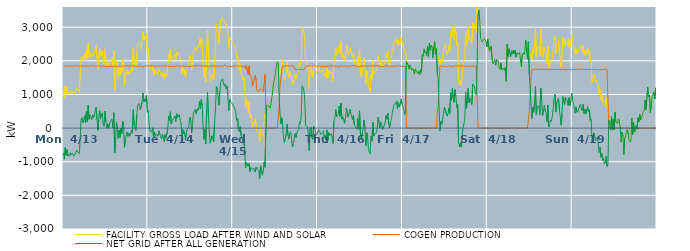
| Category | FACILITY GROSS LOAD AFTER WIND AND SOLAR | COGEN PRODUCTION | NET GRID AFTER ALL GENERATION |
|---|---|---|---|
|  Mon  4/13 | 1102 | 1840 | -738 |
|  Mon  4/13 | 901 | 1826 | -925 |
|  Mon  4/13 | 1254 | 1835 | -581 |
|  Mon  4/13 | 1013 | 1824 | -811 |
|  Mon  4/13 | 1208 | 1852 | -644 |
|  Mon  4/13 | 1005 | 1834 | -829 |
|  Mon  4/13 | 1051 | 1841 | -790 |
|  Mon  4/13 | 1019 | 1855 | -836 |
|  Mon  4/13 | 1110 | 1841 | -731 |
|  Mon  4/13 | 1040 | 1835 | -795 |
|  Mon  4/13 | 1102 | 1848 | -746 |
|  Mon  4/13 | 1069 | 1843 | -774 |
|  Mon  4/13 | 1000 | 1833 | -833 |
|  Mon  4/13 | 1059 | 1849 | -790 |
|  Mon  4/13 | 1077 | 1854 | -777 |
|  Mon  4/13 | 1197 | 1847 | -650 |
|  Mon  4/13 | 1133 | 1847 | -714 |
|  Mon  4/13 | 1143 | 1844 | -701 |
|  Mon  4/13 | 1071 | 1834 | -763 |
|  Mon  4/13 | 1581 | 1847 | -266 |
|  Mon  4/13 | 2106 | 1840 | 266 |
|  Mon  4/13 | 2146 | 1833 | 313 |
|  Mon  4/13 | 2012 | 1848 | 164 |
|  Mon  4/13 | 2089 | 1851 | 238 |
|  Mon  4/13 | 2207 | 1838 | 369 |
|  Mon  4/13 | 2001 | 1843 | 158 |
|  Mon  4/13 | 2347 | 1849 | 498 |
|  Mon  4/13 | 2049 | 1860 | 189 |
|  Mon  4/13 | 2512 | 1835 | 677 |
|  Mon  4/13 | 2100 | 1838 | 262 |
|  Mon  4/13 | 2244 | 1848 | 396 |
|  Mon  4/13 | 2231 | 1845 | 386 |
|  Mon  4/13 | 2101 | 1849 | 252 |
|  Mon  4/13 | 2225 | 1830 | 395 |
|  Mon  4/13 | 2163 | 1854 | 309 |
|  Mon  4/13 | 2199 | 1842 | 357 |
|  Mon  4/13 | 2353 | 1841 | 512 |
|  Mon  4/13 | 2458 | 1840 | 618 |
|  Mon  4/13 | 2095 | 1836 | 259 |
|  Mon  4/13 | 1766 | 1832 | -66 |
|  Mon  4/13 | 2123 | 1860 | 263 |
|  Mon  4/13 | 2371 | 1840 | 531 |
|  Mon  4/13 | 2121 | 1832 | 289 |
|  Mon  4/13 | 2251 | 1845 | 406 |
|  Mon  4/13 | 2293 | 1843 | 450 |
|  Mon  4/13 | 1930 | 1836 | 94 |
|  Mon  4/13 | 1891 | 1836 | 55 |
|  Mon  4/13 | 2358 | 1851 | 507 |
|  Mon  4/13 | 2023 | 1827 | 196 |
|  Mon  4/13 | 1859 | 1846 | 13 |
|  Mon  4/13 | 1951 | 1825 | 126 |
|  Mon  4/13 | 1825 | 1835 | -10 |
|  Mon  4/13 | 1968 | 1848 | 120 |
|  Mon  4/13 | 2028 | 1836 | 192 |
|  Mon  4/13 | 1999 | 1834 | 165 |
|  Mon  4/13 | 2099 | 1834 | 265 |
|  Mon  4/13 | 1834 | 1829 | 5 |
|  Mon  4/13 | 2299 | 1842 | 457 |
|  Mon  4/13 | 1120 | 1857 | -737 |
|  Mon  4/13 | 1453 | 1847 | -394 |
|  Mon  4/13 | 2012 | 1827 | 185 |
|  Mon  4/13 | 1830 | 1851 | -21 |
|  Mon  4/13 | 1538 | 1849 | -311 |
|  Mon  4/13 | 1791 | 1848 | -57 |
|  Mon  4/13 | 1556 | 1833 | -277 |
|  Mon  4/13 | 1841 | 1851 | -10 |
|  Mon  4/13 | 1662 | 1838 | -176 |
|  Mon  4/13 | 2052 | 1846 | 206 |
|  Mon  4/13 | 2009 | 1846 | 163 |
|  Mon  4/13 | 1263 | 1839 | -576 |
|  Mon  4/13 | 1503 | 1851 | -348 |
|  Mon  4/13 | 1607 | 1851 | -244 |
|  Mon  4/13 | 1732 | 1852 | -120 |
|  Mon  4/13 | 1605 | 1848 | -243 |
|  Mon  4/13 | 1687 | 1840 | -153 |
|  Mon  4/13 | 1614 | 1855 | -241 |
|  Mon  4/13 | 1664 | 1845 | -181 |
|  Mon  4/13 | 1771 | 1843 | -72 |
|  Mon  4/13 | 1704 | 1855 | -151 |
|  Mon  4/13 | 2373 | 1828 | 545 |
|  Mon  4/13 | 1948 | 1850 | 98 |
|  Mon  4/13 | 1861 | 1830 | 31 |
|  Mon  4/13 | 1765 | 1828 | -63 |
|  Mon  4/13 | 2227 | 1846 | 381 |
|  Mon  4/13 | 2544 | 1847 | 697 |
|  Mon  4/13 | 2571 | 1858 | 713 |
|  Mon  4/13 | 2579 | 1849 | 730 |
|  Mon  4/13 | 2394 | 1853 | 541 |
|  Mon  4/13 | 2362 | 1838 | 524 |
|  Mon  4/13 | 2613 | 1839 | 774 |
|  Mon  4/13 | 2869 | 1825 | 1044 |
|  Mon  4/13 | 2640 | 1853 | 787 |
|  Mon  4/13 | 2717 | 1850 | 867 |
|  Mon  4/13 | 2625 | 1831 | 794 |
|  Mon  4/13 | 2812 | 1846 | 966 |
|  Mon  4/13 | 2310 | 1840 | 470 |
|  Tue  4/14 | 2374 | 1858 | 516 |
|  Tue  4/14 | 1931 | 1835 | 96 |
|  Tue  4/14 | 1749 | 1841 | -92 |
|  Tue  4/14 | 1738 | 1851 | -113 |
|  Tue  4/14 | 1741 | 1854 | -113 |
|  Tue  4/14 | 1852 | 1842 | 10 |
|  Tue  4/14 | 1556 | 1835 | -279 |
|  Tue  4/14 | 1734 | 1857 | -123 |
|  Tue  4/14 | 1604 | 1850 | -246 |
|  Tue  4/14 | 1672 | 1844 | -172 |
|  Tue  4/14 | 1669 | 1837 | -168 |
|  Tue  4/14 | 1605 | 1847 | -242 |
|  Tue  4/14 | 1766 | 1843 | -77 |
|  Tue  4/14 | 1672 | 1854 | -182 |
|  Tue  4/14 | 1638 | 1845 | -207 |
|  Tue  4/14 | 1516 | 1842 | -326 |
|  Tue  4/14 | 1652 | 1836 | -184 |
|  Tue  4/14 | 1564 | 1850 | -286 |
|  Tue  4/14 | 1459 | 1855 | -396 |
|  Tue  4/14 | 1642 | 1838 | -196 |
|  Tue  4/14 | 1551 | 1849 | -298 |
|  Tue  4/14 | 1519 | 1840 | -321 |
|  Tue  4/14 | 1816 | 1842 | -26 |
|  Tue  4/14 | 2195 | 1839 | 356 |
|  Tue  4/14 | 2066 | 1835 | 231 |
|  Tue  4/14 | 2336 | 1850 | 486 |
|  Tue  4/14 | 1960 | 1842 | 118 |
|  Tue  4/14 | 2096 | 1850 | 246 |
|  Tue  4/14 | 2102 | 1834 | 268 |
|  Tue  4/14 | 2136 | 1846 | 290 |
|  Tue  4/14 | 2194 | 1837 | 357 |
|  Tue  4/14 | 2050 | 1856 | 194 |
|  Tue  4/14 | 2279 | 1851 | 428 |
|  Tue  4/14 | 2155 | 1843 | 312 |
|  Tue  4/14 | 2180 | 1845 | 335 |
|  Tue  4/14 | 2252 | 1850 | 402 |
|  Tue  4/14 | 2087 | 1839 | 248 |
|  Tue  4/14 | 1991 | 1839 | 152 |
|  Tue  4/14 | 1613 | 1841 | -228 |
|  Tue  4/14 | 1808 | 1855 | -47 |
|  Tue  4/14 | 1684 | 1847 | -163 |
|  Tue  4/14 | 1744 | 1850 | -106 |
|  Tue  4/14 | 1492 | 1836 | -344 |
|  Tue  4/14 | 1672 | 1845 | -173 |
|  Tue  4/14 | 1808 | 1841 | -33 |
|  Tue  4/14 | 1856 | 1844 | 12 |
|  Tue  4/14 | 1942 | 1837 | 105 |
|  Tue  4/14 | 2167 | 1842 | 325 |
|  Tue  4/14 | 2082 | 1835 | 247 |
|  Tue  4/14 | 1709 | 1854 | -145 |
|  Tue  4/14 | 1938 | 1840 | 98 |
|  Tue  4/14 | 2304 | 1861 | 443 |
|  Tue  4/14 | 2312 | 1852 | 460 |
|  Tue  4/14 | 2401 | 1840 | 561 |
|  Tue  4/14 | 2278 | 1850 | 428 |
|  Tue  4/14 | 2273 | 1856 | 417 |
|  Tue  4/14 | 2435 | 1850 | 585 |
|  Tue  4/14 | 2393 | 1848 | 545 |
|  Tue  4/14 | 2654 | 1855 | 799 |
|  Tue  4/14 | 2426 | 1851 | 575 |
|  Tue  4/14 | 2694 | 1848 | 846 |
|  Tue  4/14 | 2514 | 1854 | 660 |
|  Tue  4/14 | 1856 | 1842 | 14 |
|  Tue  4/14 | 1508 | 1847 | -339 |
|  Tue  4/14 | 1810 | 1841 | -31 |
|  Tue  4/14 | 1378 | 1846 | -468 |
|  Tue  4/14 | 2370 | 1843 | 527 |
|  Tue  4/14 | 2914 | 1844 | 1070 |
|  Tue  4/14 | 2187 | 1826 | 361 |
|  Tue  4/14 | 1718 | 1844 | -126 |
|  Tue  4/14 | 1391 | 1842 | -451 |
|  Tue  4/14 | 1421 | 1869 | -448 |
|  Tue  4/14 | 1619 | 1847 | -228 |
|  Tue  4/14 | 1517 | 1837 | -320 |
|  Tue  4/14 | 1437 | 1849 | -412 |
|  Tue  4/14 | 2025 | 1841 | 184 |
|  Tue  4/14 | 2398 | 1842 | 556 |
|  Tue  4/14 | 3087 | 1841 | 1246 |
|  Tue  4/14 | 2966 | 1843 | 1123 |
|  Tue  4/14 | 2808 | 1846 | 962 |
|  Tue  4/14 | 2514 | 1833 | 681 |
|  Tue  4/14 | 2952 | 1848 | 1104 |
|  Tue  4/14 | 3237 | 1848 | 1389 |
|  Tue  4/14 | 3225 | 1834 | 1391 |
|  Tue  4/14 | 3288 | 1828 | 1460 |
|  Tue  4/14 | 3155 | 1846 | 1309 |
|  Tue  4/14 | 3129 | 1869 | 1260 |
|  Tue  4/14 | 3167 | 1848 | 1319 |
|  Tue  4/14 | 3030 | 1855 | 1175 |
|  Tue  4/14 | 3079 | 1825 | 1254 |
|  Tue  4/14 | 2830 | 1854 | 976 |
|  Tue  4/14 | 2354 | 1839 | 515 |
|  Tue  4/14 | 2689 | 1833 | 856 |
|  Tue  4/14 | 2626 | 1838 | 788 |
|  Tue  4/14 | 2630 | 1838 | 792 |
|  Tue  4/14 | 2551 | 1830 | 721 |
|  Wed  4/15 | 2545 | 1844 | 701 |
|  Wed  4/15 | 2465 | 1847 | 618 |
|  Wed  4/15 | 2412 | 1841 | 571 |
|  Wed  4/15 | 2319 | 1848 | 471 |
|  Wed  4/15 | 2085 | 1854 | 231 |
|  Wed  4/15 | 2146 | 1851 | 295 |
|  Wed  4/15 | 1809 | 1862 | -53 |
|  Wed  4/15 | 1731 | 1839 | -108 |
|  Wed  4/15 | 1884 | 1836 | 48 |
|  Wed  4/15 | 1622 | 1844 | -222 |
|  Wed  4/15 | 1608 | 1849 | -241 |
|  Wed  4/15 | 1425 | 1825 | -400 |
|  Wed  4/15 | 1520 | 1851 | -331 |
|  Wed  4/15 | 1220 | 1834 | -614 |
|  Wed  4/15 | 574 | 1759 | -1185 |
|  Wed  4/15 | 846 | 1855 | -1009 |
|  Wed  4/15 | 766 | 1831 | -1065 |
|  Wed  4/15 | 456 | 1597 | -1141 |
|  Wed  4/15 | 784 | 1834 | -1050 |
|  Wed  4/15 | 299 | 1584 | -1285 |
|  Wed  4/15 | 406 | 1582 | -1176 |
|  Wed  4/15 | 270 | 1468 | -1198 |
|  Wed  4/15 | 22 | 1252 | -1230 |
|  Wed  4/15 | 178 | 1367 | -1189 |
|  Wed  4/15 | 144 | 1367 | -1223 |
|  Wed  4/15 | 266 | 1573 | -1307 |
|  Wed  4/15 | 254 | 1411 | -1157 |
|  Wed  4/15 | -104 | 1103 | -1207 |
|  Wed  4/15 | -125 | 1094 | -1219 |
|  Wed  4/15 | -171 | 1092 | -1263 |
|  Wed  4/15 | -409 | 1096 | -1505 |
|  Wed  4/15 | 56 | 1178 | -1122 |
|  Wed  4/15 | -102 | 1140 | -1242 |
|  Wed  4/15 | -242 | 1156 | -1398 |
|  Wed  4/15 | -203 | 1073 | -1276 |
|  Wed  4/15 | 290 | 1304 | -1014 |
|  Wed  4/15 | 429 | 1594 | -1165 |
|  Wed  4/15 | 389 | 454 | -65 |
|  Wed  4/15 | 672 | 0 | 672 |
|  Wed  4/15 | 674 | 0 | 674 |
|  Wed  4/15 | 666 | 0 | 666 |
|  Wed  4/15 | 668 | 0 | 668 |
|  Wed  4/15 | 593 | 0 | 593 |
|  Wed  4/15 | 751 | 0 | 751 |
|  Wed  4/15 | 944 | 0 | 944 |
|  Wed  4/15 | 925 | 0 | 925 |
|  Wed  4/15 | 1374 | 0 | 1374 |
|  Wed  4/15 | 1484 | 0 | 1484 |
|  Wed  4/15 | 1694 | 0 | 1694 |
|  Wed  4/15 | 1718 | 0 | 1718 |
|  Wed  4/15 | 1974 | 0 | 1974 |
|  Wed  4/15 | 1887 | 0 | 1887 |
|  Wed  4/15 | 1538 | 603 | 935 |
|  Wed  4/15 | 1698 | 1252 | 446 |
|  Wed  4/15 | 1616 | 1489 | 127 |
|  Wed  4/15 | 2048 | 1742 | 306 |
|  Wed  4/15 | 1891 | 1854 | 37 |
|  Wed  4/15 | 1547 | 1851 | -304 |
|  Wed  4/15 | 1419 | 1842 | -423 |
|  Wed  4/15 | 1440 | 1856 | -416 |
|  Wed  4/15 | 1656 | 1842 | -186 |
|  Wed  4/15 | 1955 | 1839 | 116 |
|  Wed  4/15 | 1653 | 1856 | -203 |
|  Wed  4/15 | 1502 | 1827 | -325 |
|  Wed  4/15 | 1683 | 1842 | -159 |
|  Wed  4/15 | 1703 | 1817 | -114 |
|  Wed  4/15 | 1546 | 1852 | -306 |
|  Wed  4/15 | 1284 | 1841 | -557 |
|  Wed  4/15 | 1373 | 1844 | -471 |
|  Wed  4/15 | 1363 | 1845 | -482 |
|  Wed  4/15 | 1584 | 1744 | -160 |
|  Wed  4/15 | 1462 | 1735 | -273 |
|  Wed  4/15 | 1585 | 1722 | -137 |
|  Wed  4/15 | 1595 | 1744 | -149 |
|  Wed  4/15 | 1704 | 1749 | -45 |
|  Wed  4/15 | 1934 | 1742 | 192 |
|  Wed  4/15 | 1876 | 1742 | 134 |
|  Wed  4/15 | 2097 | 1731 | 366 |
|  Wed  4/15 | 3000 | 1745 | 1255 |
|  Wed  4/15 | 2966 | 1750 | 1216 |
|  Wed  4/15 | 2852 | 1734 | 1118 |
|  Wed  4/15 | 2603 | 1740 | 863 |
|  Wed  4/15 | 1921 | 1837 | 84 |
|  Wed  4/15 | 1966 | 1863 | 103 |
|  Wed  4/15 | 1883 | 1842 | 41 |
|  Wed  4/15 | 1695 | 1848 | -153 |
|  Wed  4/15 | 1186 | 1856 | -670 |
|  Wed  4/15 | 1812 | 1848 | -36 |
|  Wed  4/15 | 1871 | 1841 | 30 |
|  Wed  4/15 | 1579 | 1850 | -271 |
|  Wed  4/15 | 1506 | 1843 | -337 |
|  Wed  4/15 | 1877 | 1820 | 57 |
|  Wed  4/15 | 1849 | 1859 | -10 |
|  Wed  4/15 | 1786 | 1846 | -60 |
|  Wed  4/15 | 1622 | 1834 | -212 |
|  Wed  4/15 | 1680 | 1850 | -170 |
|  Thu  4/16 | 1746 | 1851 | -105 |
|  Thu  4/16 | 1801 | 1854 | -53 |
|  Thu  4/16 | 1724 | 1838 | -114 |
|  Thu  4/16 | 1646 | 1842 | -196 |
|  Thu  4/16 | 1619 | 1837 | -218 |
|  Thu  4/16 | 1701 | 1833 | -132 |
|  Thu  4/16 | 1753 | 1843 | -90 |
|  Thu  4/16 | 1559 | 1851 | -292 |
|  Thu  4/16 | 1615 | 1828 | -213 |
|  Thu  4/16 | 1497 | 1844 | -347 |
|  Thu  4/16 | 1785 | 1840 | -55 |
|  Thu  4/16 | 1469 | 1838 | -369 |
|  Thu  4/16 | 1713 | 1846 | -133 |
|  Thu  4/16 | 1618 | 1841 | -223 |
|  Thu  4/16 | 1596 | 1846 | -250 |
|  Thu  4/16 | 1680 | 1849 | -169 |
|  Thu  4/16 | 1568 | 1856 | -288 |
|  Thu  4/16 | 1393 | 1850 | -457 |
|  Thu  4/16 | 2046 | 1842 | 204 |
|  Thu  4/16 | 2123 | 1850 | 273 |
|  Thu  4/16 | 2404 | 1849 | 555 |
|  Thu  4/16 | 2163 | 1825 | 338 |
|  Thu  4/16 | 2145 | 1833 | 312 |
|  Thu  4/16 | 2275 | 1848 | 427 |
|  Thu  4/16 | 2465 | 1809 | 656 |
|  Thu  4/16 | 2202 | 1855 | 347 |
|  Thu  4/16 | 2591 | 1847 | 744 |
|  Thu  4/16 | 2109 | 1842 | 267 |
|  Thu  4/16 | 2191 | 1854 | 337 |
|  Thu  4/16 | 2111 | 1840 | 271 |
|  Thu  4/16 | 1990 | 1848 | 142 |
|  Thu  4/16 | 2147 | 1849 | 298 |
|  Thu  4/16 | 2457 | 1860 | 597 |
|  Thu  4/16 | 2398 | 1827 | 571 |
|  Thu  4/16 | 2183 | 1855 | 328 |
|  Thu  4/16 | 2247 | 1841 | 406 |
|  Thu  4/16 | 2395 | 1835 | 560 |
|  Thu  4/16 | 2297 | 1848 | 449 |
|  Thu  4/16 | 2322 | 1846 | 476 |
|  Thu  4/16 | 2109 | 1857 | 252 |
|  Thu  4/16 | 2213 | 1840 | 373 |
|  Thu  4/16 | 1952 | 1849 | 103 |
|  Thu  4/16 | 1914 | 1856 | 58 |
|  Thu  4/16 | 1851 | 1854 | -3 |
|  Thu  4/16 | 1820 | 1855 | -35 |
|  Thu  4/16 | 2135 | 1838 | 297 |
|  Thu  4/16 | 1822 | 1861 | -39 |
|  Thu  4/16 | 2342 | 1832 | 510 |
|  Thu  4/16 | 1653 | 1842 | -189 |
|  Thu  4/16 | 1495 | 1841 | -346 |
|  Thu  4/16 | 1666 | 1841 | -175 |
|  Thu  4/16 | 1815 | 1848 | -33 |
|  Thu  4/16 | 2082 | 1841 | 241 |
|  Thu  4/16 | 1883 | 1856 | 27 |
|  Thu  4/16 | 1317 | 1842 | -525 |
|  Thu  4/16 | 1702 | 1835 | -133 |
|  Thu  4/16 | 1611 | 1841 | -230 |
|  Thu  4/16 | 1242 | 1843 | -601 |
|  Thu  4/16 | 1135 | 1856 | -721 |
|  Thu  4/16 | 1078 | 1849 | -771 |
|  Thu  4/16 | 1608 | 1846 | -238 |
|  Thu  4/16 | 1460 | 1848 | -388 |
|  Thu  4/16 | 2006 | 1833 | 173 |
|  Thu  4/16 | 1611 | 1848 | -237 |
|  Thu  4/16 | 1670 | 1841 | -171 |
|  Thu  4/16 | 1698 | 1846 | -148 |
|  Thu  4/16 | 1710 | 1848 | -138 |
|  Thu  4/16 | 1845 | 1856 | -11 |
|  Thu  4/16 | 2162 | 1836 | 326 |
|  Thu  4/16 | 2015 | 1840 | 175 |
|  Thu  4/16 | 1863 | 1850 | 13 |
|  Thu  4/16 | 2010 | 1829 | 181 |
|  Thu  4/16 | 1974 | 1851 | 123 |
|  Thu  4/16 | 1793 | 1835 | -42 |
|  Thu  4/16 | 1877 | 1841 | 36 |
|  Thu  4/16 | 1909 | 1843 | 66 |
|  Thu  4/16 | 2009 | 1828 | 181 |
|  Thu  4/16 | 2229 | 1854 | 375 |
|  Thu  4/16 | 2114 | 1851 | 263 |
|  Thu  4/16 | 2290 | 1846 | 444 |
|  Thu  4/16 | 1965 | 1848 | 117 |
|  Thu  4/16 | 1851 | 1839 | 12 |
|  Thu  4/16 | 2037 | 1838 | 199 |
|  Thu  4/16 | 2072 | 1839 | 233 |
|  Thu  4/16 | 2308 | 1846 | 462 |
|  Thu  4/16 | 2278 | 1831 | 447 |
|  Thu  4/16 | 2535 | 1833 | 702 |
|  Thu  4/16 | 2536 | 1842 | 694 |
|  Thu  4/16 | 2591 | 1850 | 741 |
|  Thu  4/16 | 2655 | 1848 | 807 |
|  Thu  4/16 | 2433 | 1851 | 582 |
|  Thu  4/16 | 2609 | 1854 | 755 |
|  Thu  4/16 | 2466 | 1836 | 630 |
|  Thu  4/16 | 2545 | 1832 | 713 |
|  Thu  4/16 | 2707 | 1842 | 865 |
|  Thu  4/16 | 2555 | 1835 | 720 |
|  Fri  4/17 | 2569 | 1858 | 711 |
|  Fri  4/17 | 2383 | 1834 | 549 |
|  Fri  4/17 | 2246 | 1843 | 403 |
|  Fri  4/17 | 2291 | 1843 | 448 |
|  Fri  4/17 | 1979 | 0 | 1979 |
|  Fri  4/17 | 1988 | 0 | 1988 |
|  Fri  4/17 | 1869 | 0 | 1869 |
|  Fri  4/17 | 1750 | 0 | 1750 |
|  Fri  4/17 | 1876 | 0 | 1876 |
|  Fri  4/17 | 1823 | 0 | 1823 |
|  Fri  4/17 | 1715 | 0 | 1715 |
|  Fri  4/17 | 1770 | 0 | 1770 |
|  Fri  4/17 | 1728 | 0 | 1728 |
|  Fri  4/17 | 1601 | 0 | 1601 |
|  Fri  4/17 | 1762 | 0 | 1762 |
|  Fri  4/17 | 1720 | 0 | 1720 |
|  Fri  4/17 | 1706 | 0 | 1706 |
|  Fri  4/17 | 1611 | 0 | 1611 |
|  Fri  4/17 | 1691 | 0 | 1691 |
|  Fri  4/17 | 1580 | 0 | 1580 |
|  Fri  4/17 | 1736 | 0 | 1736 |
|  Fri  4/17 | 1658 | 0 | 1658 |
|  Fri  4/17 | 2183 | 0 | 2183 |
|  Fri  4/17 | 2135 | 0 | 2135 |
|  Fri  4/17 | 2354 | 0 | 2354 |
|  Fri  4/17 | 2228 | 0 | 2228 |
|  Fri  4/17 | 2279 | 0 | 2279 |
|  Fri  4/17 | 2153 | 0 | 2153 |
|  Fri  4/17 | 2421 | 0 | 2421 |
|  Fri  4/17 | 2115 | 0 | 2115 |
|  Fri  4/17 | 2524 | 0 | 2524 |
|  Fri  4/17 | 2317 | 0 | 2317 |
|  Fri  4/17 | 2467 | 0 | 2467 |
|  Fri  4/17 | 2430 | 0 | 2430 |
|  Fri  4/17 | 2081 | 0 | 2081 |
|  Fri  4/17 | 2408 | 0 | 2408 |
|  Fri  4/17 | 2570 | 0 | 2570 |
|  Fri  4/17 | 2191 | 0 | 2191 |
|  Fri  4/17 | 2359 | 0 | 2359 |
|  Fri  4/17 | 2085 | 461 | 1624 |
|  Fri  4/17 | 2124 | 692 | 1432 |
|  Fri  4/17 | 1947 | 1397 | 550 |
|  Fri  4/17 | 1778 | 1860 | -82 |
|  Fri  4/17 | 2052 | 1854 | 198 |
|  Fri  4/17 | 1955 | 1839 | 116 |
|  Fri  4/17 | 2101 | 1843 | 258 |
|  Fri  4/17 | 2285 | 1843 | 442 |
|  Fri  4/17 | 2478 | 1855 | 623 |
|  Fri  4/17 | 2436 | 1833 | 603 |
|  Fri  4/17 | 2279 | 1848 | 431 |
|  Fri  4/17 | 2176 | 1824 | 352 |
|  Fri  4/17 | 2277 | 1848 | 429 |
|  Fri  4/17 | 2454 | 1857 | 597 |
|  Fri  4/17 | 2269 | 1843 | 426 |
|  Fri  4/17 | 2873 | 1827 | 1046 |
|  Fri  4/17 | 2669 | 1843 | 826 |
|  Fri  4/17 | 3005 | 1833 | 1172 |
|  Fri  4/17 | 2728 | 1842 | 886 |
|  Fri  4/17 | 2610 | 1849 | 761 |
|  Fri  4/17 | 2991 | 1846 | 1145 |
|  Fri  4/17 | 2788 | 1847 | 941 |
|  Fri  4/17 | 2463 | 1851 | 612 |
|  Fri  4/17 | 2555 | 1845 | 710 |
|  Fri  4/17 | 1427 | 1838 | -411 |
|  Fri  4/17 | 1294 | 1852 | -558 |
|  Fri  4/17 | 1405 | 1845 | -440 |
|  Fri  4/17 | 1276 | 1832 | -556 |
|  Fri  4/17 | 1552 | 1830 | -278 |
|  Fri  4/17 | 1888 | 1861 | 27 |
|  Fri  4/17 | 1875 | 1829 | 46 |
|  Fri  4/17 | 2053 | 1838 | 215 |
|  Fri  4/17 | 2918 | 1845 | 1073 |
|  Fri  4/17 | 2443 | 1854 | 589 |
|  Fri  4/17 | 2428 | 1832 | 596 |
|  Fri  4/17 | 3027 | 1847 | 1180 |
|  Fri  4/17 | 2593 | 1845 | 748 |
|  Fri  4/17 | 2724 | 1848 | 876 |
|  Fri  4/17 | 2678 | 1843 | 835 |
|  Fri  4/17 | 2534 | 1832 | 702 |
|  Fri  4/17 | 3153 | 1851 | 1302 |
|  Fri  4/17 | 3165 | 1852 | 1313 |
|  Fri  4/17 | 3066 | 1834 | 1232 |
|  Fri  4/17 | 2893 | 1854 | 1039 |
|  Fri  4/17 | 2841 | 1849 | 992 |
|  Fri  4/17 | 3701 | 1834 | 1867 |
|  Fri  4/17 | 3384 | 0 | 3384 |
|  Fri  4/17 | 3509 | 0 | 3509 |
|  Fri  4/17 | 3203 | 0 | 3203 |
|  Fri  4/17 | 2653 | 0 | 2653 |
|  Fri  4/17 | 2660 | 0 | 2660 |
|  Fri  4/17 | 2560 | 0 | 2560 |
|  Fri  4/17 | 2611 | 0 | 2611 |
|  Fri  4/17 | 2659 | 0 | 2659 |
|  Fri  4/17 | 2646 | 0 | 2646 |
|  Fri  4/17 | 2592 | 0 | 2592 |
|  Fri  4/17 | 2415 | 0 | 2415 |
|  Sat  4/18 | 2647 | 0 | 2647 |
|  Sat  4/18 | 2619 | 0 | 2619 |
|  Sat  4/18 | 2287 | 0 | 2287 |
|  Sat  4/18 | 2343 | 0 | 2343 |
|  Sat  4/18 | 2443 | 0 | 2443 |
|  Sat  4/18 | 2018 | 0 | 2018 |
|  Sat  4/18 | 1915 | 0 | 1915 |
|  Sat  4/18 | 1895 | 0 | 1895 |
|  Sat  4/18 | 2035 | 0 | 2035 |
|  Sat  4/18 | 1874 | 0 | 1874 |
|  Sat  4/18 | 2038 | 0 | 2038 |
|  Sat  4/18 | 2038 | 0 | 2038 |
|  Sat  4/18 | 1995 | 0 | 1995 |
|  Sat  4/18 | 1792 | 0 | 1792 |
|  Sat  4/18 | 1744 | 0 | 1744 |
|  Sat  4/18 | 1937 | 0 | 1937 |
|  Sat  4/18 | 1724 | 0 | 1724 |
|  Sat  4/18 | 1738 | 0 | 1738 |
|  Sat  4/18 | 1781 | 0 | 1781 |
|  Sat  4/18 | 1712 | 0 | 1712 |
|  Sat  4/18 | 1817 | 0 | 1817 |
|  Sat  4/18 | 1391 | 0 | 1391 |
|  Sat  4/18 | 2491 | 0 | 2491 |
|  Sat  4/18 | 2124 | 0 | 2124 |
|  Sat  4/18 | 2360 | 0 | 2360 |
|  Sat  4/18 | 2369 | 0 | 2369 |
|  Sat  4/18 | 2131 | 0 | 2131 |
|  Sat  4/18 | 2298 | 0 | 2298 |
|  Sat  4/18 | 2202 | 0 | 2202 |
|  Sat  4/18 | 2317 | 0 | 2317 |
|  Sat  4/18 | 2207 | 0 | 2207 |
|  Sat  4/18 | 2307 | 0 | 2307 |
|  Sat  4/18 | 2115 | 0 | 2115 |
|  Sat  4/18 | 2233 | 0 | 2233 |
|  Sat  4/18 | 2220 | 0 | 2220 |
|  Sat  4/18 | 2205 | 0 | 2205 |
|  Sat  4/18 | 2254 | 0 | 2254 |
|  Sat  4/18 | 2231 | 0 | 2231 |
|  Sat  4/18 | 1829 | 0 | 1829 |
|  Sat  4/18 | 2164 | 0 | 2164 |
|  Sat  4/18 | 2232 | 0 | 2232 |
|  Sat  4/18 | 2186 | 0 | 2186 |
|  Sat  4/18 | 2302 | 0 | 2302 |
|  Sat  4/18 | 2612 | 0 | 2612 |
|  Sat  4/18 | 2264 | 0 | 2264 |
|  Sat  4/18 | 2070 | 0 | 2070 |
|  Sat  4/18 | 2573 | 0 | 2573 |
|  Sat  4/18 | 2096 | 499 | 1597 |
|  Sat  4/18 | 2220 | 999 | 1221 |
|  Sat  4/18 | 2202 | 1513 | 689 |
|  Sat  4/18 | 2021 | 1735 | 286 |
|  Sat  4/18 | 2354 | 1736 | 618 |
|  Sat  4/18 | 2212 | 1747 | 465 |
|  Sat  4/18 | 2503 | 1741 | 762 |
|  Sat  4/18 | 2990 | 1753 | 1237 |
|  Sat  4/18 | 2127 | 1739 | 388 |
|  Sat  4/18 | 2402 | 1746 | 656 |
|  Sat  4/18 | 2389 | 1746 | 643 |
|  Sat  4/18 | 2388 | 1746 | 642 |
|  Sat  4/18 | 2140 | 1742 | 398 |
|  Sat  4/18 | 2948 | 1758 | 1190 |
|  Sat  4/18 | 2603 | 1748 | 855 |
|  Sat  4/18 | 2105 | 1743 | 362 |
|  Sat  4/18 | 2245 | 1744 | 501 |
|  Sat  4/18 | 2408 | 1731 | 677 |
|  Sat  4/18 | 2255 | 1750 | 505 |
|  Sat  4/18 | 2208 | 1742 | 466 |
|  Sat  4/18 | 1912 | 1724 | 188 |
|  Sat  4/18 | 2441 | 1753 | 688 |
|  Sat  4/18 | 1769 | 1737 | 32 |
|  Sat  4/18 | 1875 | 1755 | 120 |
|  Sat  4/18 | 1995 | 1758 | 237 |
|  Sat  4/18 | 1939 | 1738 | 201 |
|  Sat  4/18 | 2084 | 1735 | 349 |
|  Sat  4/18 | 2311 | 1750 | 561 |
|  Sat  4/18 | 2599 | 1737 | 862 |
|  Sat  4/18 | 2750 | 1742 | 1008 |
|  Sat  4/18 | 2216 | 1741 | 475 |
|  Sat  4/18 | 2477 | 1731 | 746 |
|  Sat  4/18 | 2482 | 1744 | 738 |
|  Sat  4/18 | 2631 | 1751 | 880 |
|  Sat  4/18 | 2286 | 1722 | 564 |
|  Sat  4/18 | 2081 | 1738 | 343 |
|  Sat  4/18 | 1821 | 1740 | 81 |
|  Sat  4/18 | 2142 | 1745 | 397 |
|  Sat  4/18 | 2693 | 1757 | 936 |
|  Sat  4/18 | 2680 | 1755 | 925 |
|  Sat  4/18 | 2421 | 1720 | 701 |
|  Sat  4/18 | 2653 | 1738 | 915 |
|  Sat  4/18 | 2597 | 1736 | 861 |
|  Sat  4/18 | 2565 | 1735 | 830 |
|  Sat  4/18 | 2427 | 1753 | 674 |
|  Sat  4/18 | 2647 | 1742 | 905 |
|  Sat  4/18 | 2403 | 1735 | 668 |
|  Sat  4/18 | 2563 | 1757 | 806 |
|  Sat  4/18 | 2770 | 1735 | 1035 |
|  Sun  4/19 | 2580 | 1754 | 826 |
|  Sun  4/19 | 2492 | 1743 | 749 |
|  Sun  4/19 | 2346 | 1763 | 583 |
|  Sun  4/19 | 2185 | 1738 | 447 |
|  Sun  4/19 | 2368 | 1743 | 625 |
|  Sun  4/19 | 2216 | 1748 | 468 |
|  Sun  4/19 | 2253 | 1752 | 501 |
|  Sun  4/19 | 2342 | 1760 | 582 |
|  Sun  4/19 | 2325 | 1738 | 587 |
|  Sun  4/19 | 2459 | 1742 | 717 |
|  Sun  4/19 | 2330 | 1766 | 564 |
|  Sun  4/19 | 2277 | 1754 | 523 |
|  Sun  4/19 | 2458 | 1754 | 704 |
|  Sun  4/19 | 2184 | 1747 | 437 |
|  Sun  4/19 | 2310 | 1746 | 564 |
|  Sun  4/19 | 2161 | 1737 | 424 |
|  Sun  4/19 | 2257 | 1740 | 517 |
|  Sun  4/19 | 2381 | 1748 | 633 |
|  Sun  4/19 | 2229 | 1741 | 488 |
|  Sun  4/19 | 2285 | 1739 | 546 |
|  Sun  4/19 | 1966 | 1742 | 224 |
|  Sun  4/19 | 2013 | 1745 | 268 |
|  Sun  4/19 | 1354 | 1747 | -393 |
|  Sun  4/19 | 1444 | 1736 | -292 |
|  Sun  4/19 | 1608 | 1747 | -139 |
|  Sun  4/19 | 1518 | 1742 | -224 |
|  Sun  4/19 | 1383 | 1759 | -376 |
|  Sun  4/19 | 1432 | 1746 | -314 |
|  Sun  4/19 | 1458 | 1733 | -275 |
|  Sun  4/19 | 1259 | 1721 | -462 |
|  Sun  4/19 | 1008 | 1730 | -722 |
|  Sun  4/19 | 1163 | 1739 | -576 |
|  Sun  4/19 | 859 | 1724 | -865 |
|  Sun  4/19 | 989 | 1735 | -746 |
|  Sun  4/19 | 793 | 1754 | -961 |
|  Sun  4/19 | 830 | 1734 | -904 |
|  Sun  4/19 | 679 | 1746 | -1067 |
|  Sun  4/19 | 733 | 1755 | -1022 |
|  Sun  4/19 | 916 | 1747 | -831 |
|  Sun  4/19 | 595 | 1734 | -1139 |
|  Sun  4/19 | 647 | 1731 | -1084 |
|  Sun  4/19 | 230 | 0 | 230 |
|  Sun  4/19 | 131 | 0 | 131 |
|  Sun  4/19 | -52 | 0 | -52 |
|  Sun  4/19 | 342 | 0 | 342 |
|  Sun  4/19 | -61 | 0 | -61 |
|  Sun  4/19 | 272 | 0 | 272 |
|  Sun  4/19 | -55 | 0 | -55 |
|  Sun  4/19 | 480 | 0 | 480 |
|  Sun  4/19 | 174 | 0 | 174 |
|  Sun  4/19 | 186 | 0 | 186 |
|  Sun  4/19 | 145 | 0 | 145 |
|  Sun  4/19 | 275 | 0 | 275 |
|  Sun  4/19 | 207 | 0 | 207 |
|  Sun  4/19 | -17 | 0 | -17 |
|  Sun  4/19 | -414 | 0 | -414 |
|  Sun  4/19 | -117 | 0 | -117 |
|  Sun  4/19 | -235 | 0 | -235 |
|  Sun  4/19 | -793 | 0 | -793 |
|  Sun  4/19 | -304 | 0 | -304 |
|  Sun  4/19 | -220 | 0 | -220 |
|  Sun  4/19 | -107 | 0 | -107 |
|  Sun  4/19 | -37 | 0 | -37 |
|  Sun  4/19 | -196 | 0 | -196 |
|  Sun  4/19 | -383 | 0 | -383 |
|  Sun  4/19 | -381 | 0 | -381 |
|  Sun  4/19 | -407 | 0 | -407 |
|  Sun  4/19 | 302 | 0 | 302 |
|  Sun  4/19 | -192 | 0 | -192 |
|  Sun  4/19 | 171 | 0 | 171 |
|  Sun  4/19 | -121 | 0 | -121 |
|  Sun  4/19 | -44 | 0 | -44 |
|  Sun  4/19 | 88 | 0 | 88 |
|  Sun  4/19 | -33 | 0 | -33 |
|  Sun  4/19 | 309 | 0 | 309 |
|  Sun  4/19 | 180 | 0 | 180 |
|  Sun  4/19 | 403 | 0 | 403 |
|  Sun  4/19 | 242 | 0 | 242 |
|  Sun  4/19 | 302 | 0 | 302 |
|  Sun  4/19 | 291 | 0 | 291 |
|  Sun  4/19 | 487 | 0 | 487 |
|  Sun  4/19 | 531 | 0 | 531 |
|  Sun  4/19 | 837 | 0 | 837 |
|  Sun  4/19 | 550 | 0 | 550 |
|  Sun  4/19 | 544 | 0 | 544 |
|  Sun  4/19 | 1215 | 0 | 1215 |
|  Sun  4/19 | 924 | 0 | 924 |
|  Sun  4/19 | 981 | 0 | 981 |
|  Sun  4/19 | 458 | 0 | 458 |
|  Sun  4/19 | 682 | 0 | 682 |
|  Sun  4/19 | 926 | 0 | 926 |
|  Sun  4/19 | 914 | 0 | 914 |
|  Sun  4/19 | 1069 | 0 | 1069 |
|  Sun  4/19 | 872 | 0 | 872 |
|  Sun  4/19 | 1195 | 0 | 1195 |
|  Sun  4/19 | 1219 | 0 | 1219 |